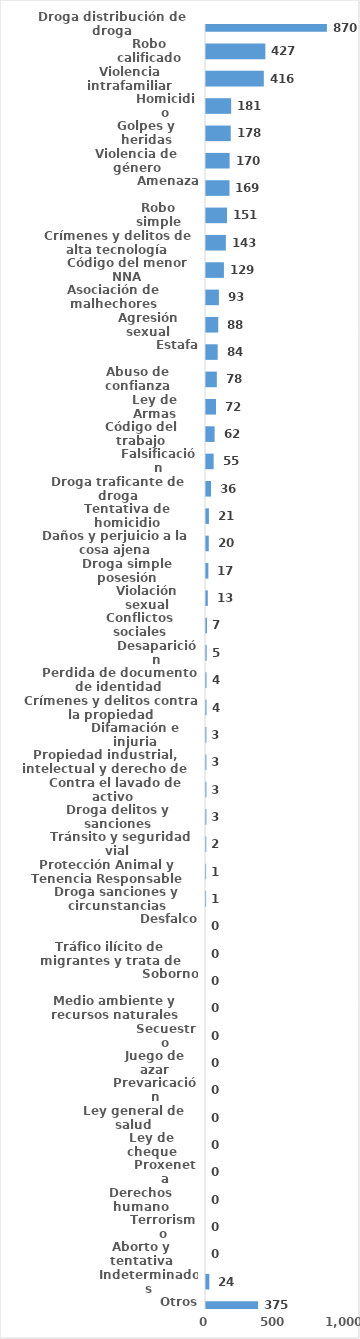
| Category | Series 0 |
|---|---|
| Droga distribución de droga | 870 |
| Robo calificado | 427 |
| Violencia intrafamiliar | 416 |
| Homicidio | 181 |
| Golpes y heridas | 178 |
| Violencia de género | 170 |
| Amenaza | 169 |
| Robo simple | 151 |
| Crímenes y delitos de alta tecnología | 143 |
| Código del menor NNA | 129 |
| Asociación de malhechores | 93 |
| Agresión sexual | 88 |
| Estafa | 84 |
| Abuso de confianza | 78 |
| Ley de Armas | 72 |
| Código del trabajo | 62 |
| Falsificación | 55 |
| Droga traficante de droga | 36 |
| Tentativa de homicidio | 21 |
| Daños y perjuicio a la cosa ajena | 20 |
| Droga simple posesión | 17 |
| Violación sexual | 13 |
| Conflictos sociales | 7 |
| Desaparición | 5 |
| Perdida de documento de identidad | 4 |
| Crímenes y delitos contra la propiedad | 4 |
| Difamación e injuria | 3 |
| Propiedad industrial, intelectual y derecho de autor | 3 |
| Contra el lavado de activo  | 3 |
| Droga delitos y sanciones | 3 |
| Tránsito y seguridad vial  | 2 |
| Protección Animal y Tenencia Responsable | 1 |
| Droga sanciones y circunstancias agravantes | 1 |
| Desfalco | 0 |
| Tráfico ilícito de migrantes y trata de personas | 0 |
| Soborno | 0 |
| Medio ambiente y recursos naturales | 0 |
| Secuestro | 0 |
| Juego de azar | 0 |
| Prevaricación | 0 |
| Ley general de salud | 0 |
| Ley de cheque | 0 |
| Proxeneta | 0 |
| Derechos humano | 0 |
| Terrorismo | 0 |
| Aborto y tentativa | 0 |
| Indeterminados | 24 |
| Otros | 375 |